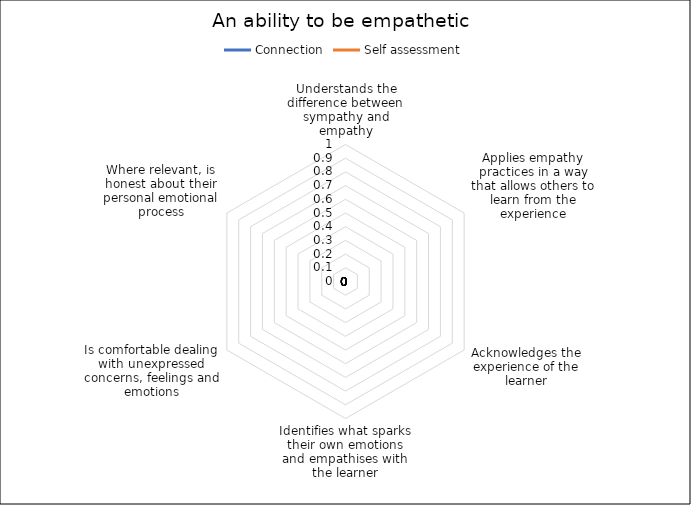
| Category | Connection | Self assessment |
|---|---|---|
| Understands the difference between sympathy and empathy | 0 | 0 |
| Applies empathy practices in a way that allows others to learn from the experience | 0 | 0 |
| Acknowledges the experience of the learner | 0 | 0 |
| Identifies what sparks their own emotions and empathises with the learner | 0 | 0 |
| Is comfortable dealing with unexpressed concerns, feelings and emotions | 0 | 0 |
| Where relevant, is honest about their personal emotional process | 0 | 0 |